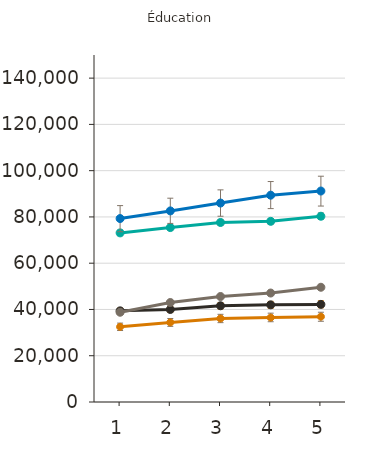
| Category | Certificat d'études collégial | Diplôme d'études collégial | Baccalauréat | Maîtrise | Doctorat | Grade professionnel |
|---|---|---|---|---|---|---|
| 1.0 | 32500 | 39400 | 38800 | 73100 | 79300 |  |
| 2.0 | 34400 | 40000 | 43000 | 75400 | 82600 |  |
| 3.0 | 36100 | 41600 | 45600 | 77600 | 86000 |  |
| 4.0 | 36500 | 42000 | 47100 | 78100 | 89400 |  |
| 5.0 | 36900 | 42200 | 49600 | 80300 | 91200 |  |